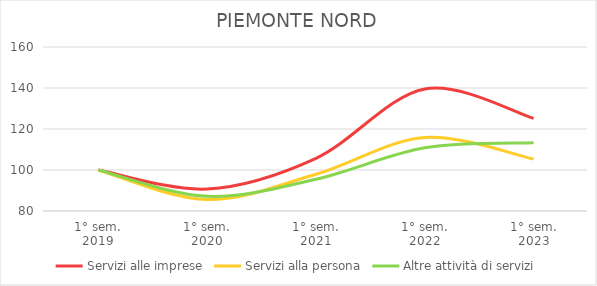
| Category | Servizi alle imprese | Servizi alla persona | Altre attività di servizi |
|---|---|---|---|
| 1° sem.
2019 | 100 | 100 | 100 |
| 1° sem.
2020 | 90.733 | 85.565 | 87.152 |
| 1° sem.
2021 | 105.7 | 97.925 | 95.521 |
| 1° sem.
2022 | 139.5 | 115.87 | 110.82 |
| 1° sem.
2023 | 125.167 | 105.385 | 113.319 |